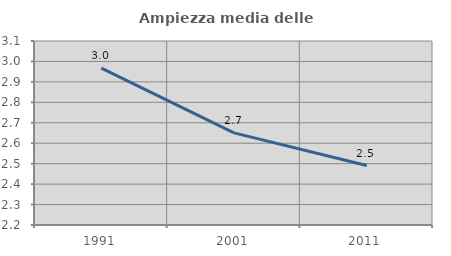
| Category | Ampiezza media delle famiglie |
|---|---|
| 1991.0 | 2.967 |
| 2001.0 | 2.651 |
| 2011.0 | 2.491 |